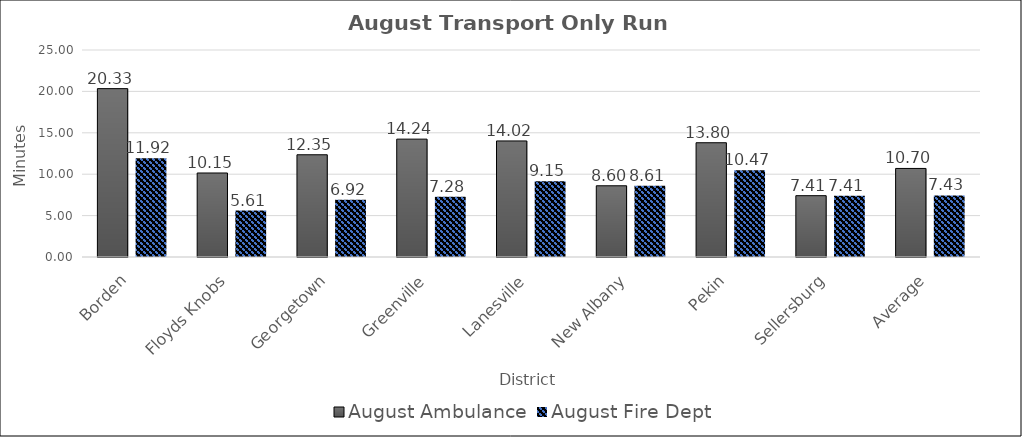
| Category | August |
|---|---|
| Borden | 11.917 |
| Floyds Knobs | 5.605 |
| Georgetown | 6.921 |
| Greenville | 7.283 |
| Lanesville | 9.155 |
| New Albany | 8.611 |
| Pekin | 10.467 |
| Sellersburg | 7.407 |
| Average | 7.432 |